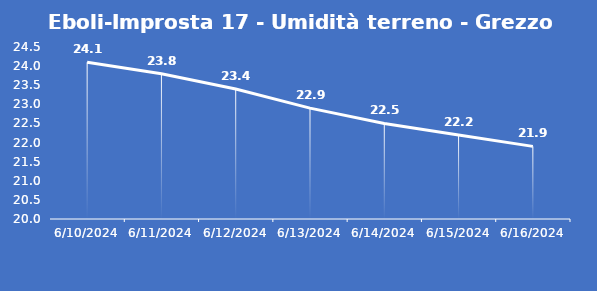
| Category | Eboli-Improsta 17 - Umidità terreno - Grezzo (%VWC) |
|---|---|
| 6/10/24 | 24.1 |
| 6/11/24 | 23.8 |
| 6/12/24 | 23.4 |
| 6/13/24 | 22.9 |
| 6/14/24 | 22.5 |
| 6/15/24 | 22.2 |
| 6/16/24 | 21.9 |